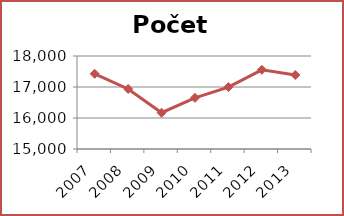
| Category | Počet čtenářů |
|---|---|
| 2007.0 | 17426 |
| 2008.0 | 16937 |
| 2009.0 | 16170 |
| 2010.0 | 16652 |
| 2011.0 | 16997 |
| 2012.0 | 17554 |
| 2013.0 | 17387 |